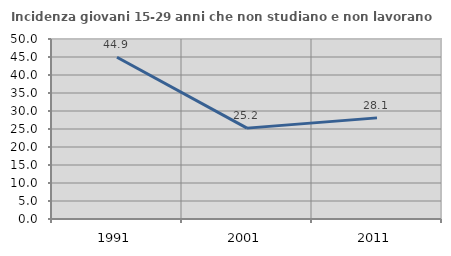
| Category | Incidenza giovani 15-29 anni che non studiano e non lavorano  |
|---|---|
| 1991.0 | 44.935 |
| 2001.0 | 25.243 |
| 2011.0 | 28.09 |